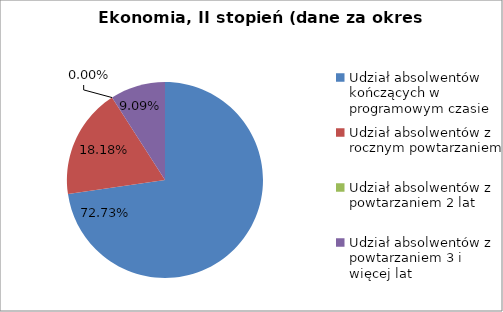
| Category | Series 0 |
|---|---|
| Udział absolwentów kończących w programowym czasie | 72.727 |
| Udział absolwentów z rocznym powtarzaniem | 18.182 |
| Udział absolwentów z powtarzaniem 2 lat | 0 |
| Udział absolwentów z powtarzaniem 3 i więcej lat | 9.091 |